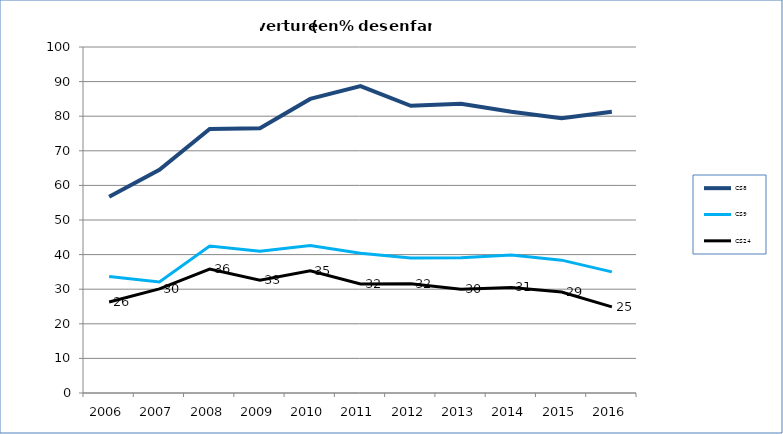
| Category | CS8 | CS9 | CS24 |
|---|---|---|---|
| 2006.0 | 56.7 | 33.7 | 26.3 |
| 2007.0 | 64.5 | 32.1 | 30.1 |
| 2008.0 | 76.3 | 42.5 | 35.8 |
| 2009.0 | 76.5 | 41 | 32.6 |
| 2010.0 | 85 | 42.6 | 35.3 |
| 2011.0 | 88.7 | 40.4 | 31.5 |
| 2012.0 | 83 | 39 | 31.6 |
| 2013.0 | 83.6 | 39.1 | 30 |
| 2014.0 | 81.3 | 39.9 | 30.5 |
| 2015.0 | 79.4 | 38.4 | 29.2 |
| 2016.0 | 81.3 | 35 | 24.9 |